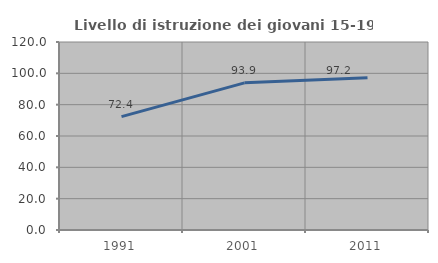
| Category | Livello di istruzione dei giovani 15-19 anni |
|---|---|
| 1991.0 | 72.4 |
| 2001.0 | 93.915 |
| 2011.0 | 97.2 |